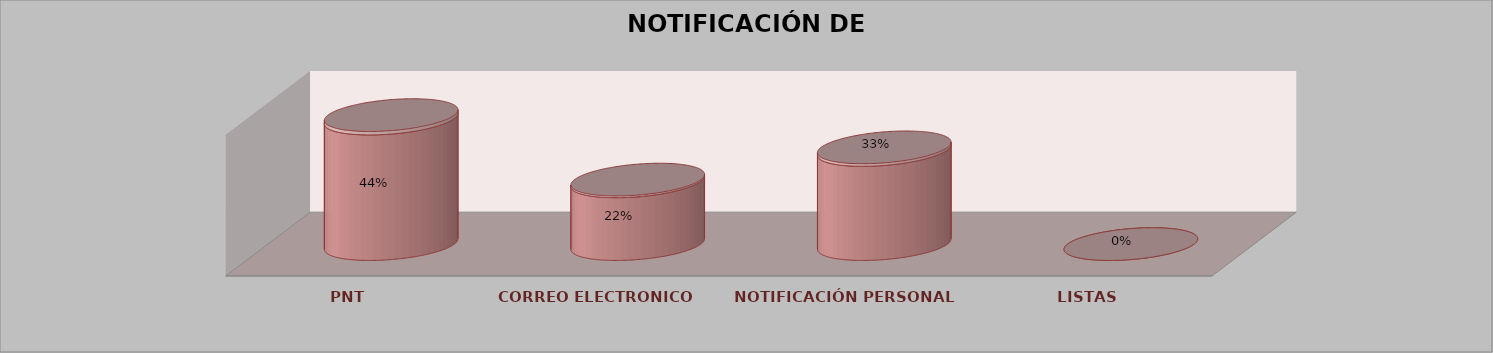
| Category | Series 0 | Series 1 | Series 2 | Series 3 | Series 4 |
|---|---|---|---|---|---|
| PNT |  |  |  | 16 | 0.444 |
| CORREO ELECTRONICO |  |  |  | 8 | 0.222 |
| NOTIFICACIÓN PERSONAL |  |  |  | 12 | 0.333 |
| LISTAS |  |  |  | 0 | 0 |